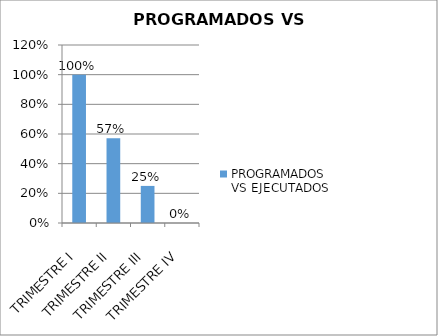
| Category | PROGRAMADOS VS EJECUTADOS |
|---|---|
| TRIMESTRE I | 1 |
| TRIMESTRE II | 0.571 |
| TRIMESTRE III | 0.25 |
| TRIMESTRE IV | 0 |